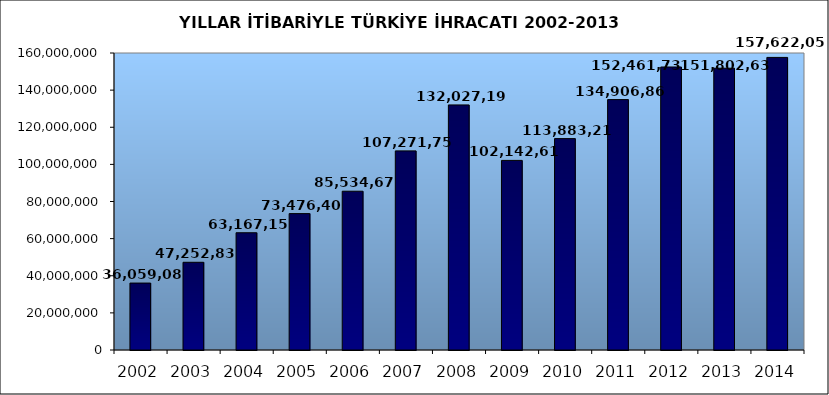
| Category | 2002 2003 2004 2005 2006 2007 2008 2009 2010 2011 2012 2013 2014 |
|---|---|
| 2002.0 | 36059089.029 |
| 2003.0 | 47252836.302 |
| 2004.0 | 63167152.82 |
| 2005.0 | 73476408.143 |
| 2006.0 | 85534675.518 |
| 2007.0 | 107271749.904 |
| 2008.0 | 132027195.626 |
| 2009.0 | 102142612.603 |
| 2010.0 | 113883219.184 |
| 2011.0 | 134906868.83 |
| 2012.0 | 152461736.556 |
| 2013.0 | 151802637.087 |
| 2014.0 | 157622057.186 |